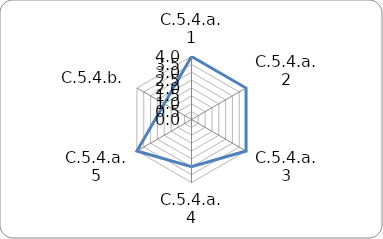
| Category | Series 0 |
|---|---|
| C.5.4.a.1 | 4 |
| C.5.4.a.2 | 4 |
| C.5.4.a.3 | 4 |
| C.5.4.a.4 | 3 |
| C.5.4.a.5 | 4 |
| C.5.4.b. | 2 |